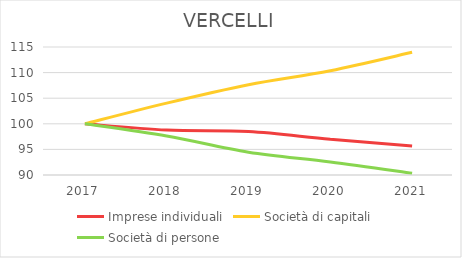
| Category | Imprese individuali | Società di capitali | Società di persone |
|---|---|---|---|
| 2017.0 | 100 | 100 | 100 |
| 2018.0 | 98.778 | 104.039 | 97.609 |
| 2019.0 | 98.481 | 107.638 | 94.452 |
| 2020.0 | 96.998 | 110.36 | 92.558 |
| 2021.0 | 95.671 | 113.96 | 90.347 |